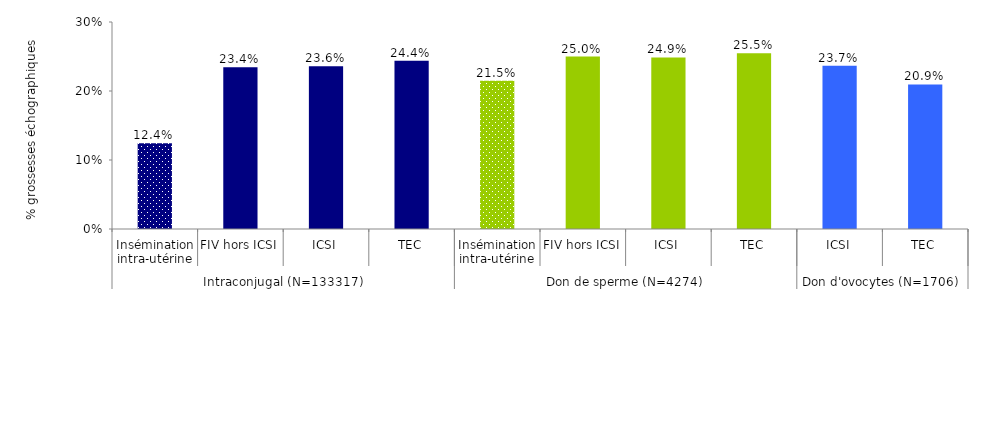
| Category | Series 0 |
|---|---|
| 0 | 0.124 |
| 1 | 0.234 |
| 2 | 0.236 |
| 3 | 0.244 |
| 4 | 0.215 |
| 5 | 0.25 |
| 6 | 0.249 |
| 7 | 0.255 |
| 8 | 0.237 |
| 9 | 0.209 |